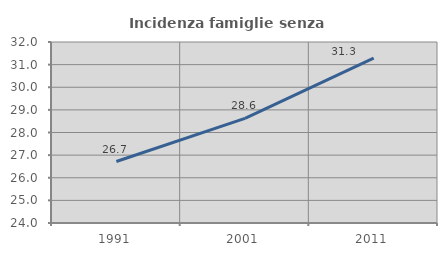
| Category | Incidenza famiglie senza nuclei |
|---|---|
| 1991.0 | 26.718 |
| 2001.0 | 28.622 |
| 2011.0 | 31.287 |